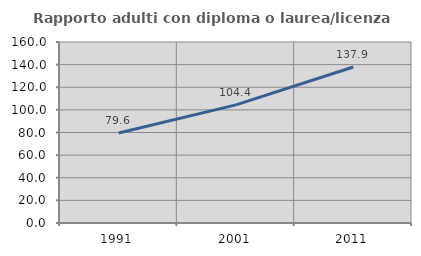
| Category | Rapporto adulti con diploma o laurea/licenza media  |
|---|---|
| 1991.0 | 79.567 |
| 2001.0 | 104.431 |
| 2011.0 | 137.896 |